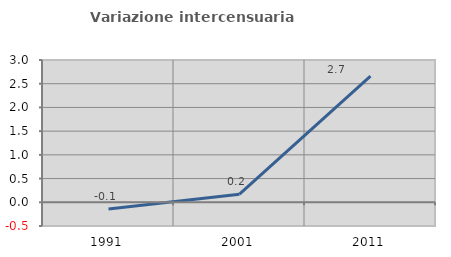
| Category | Variazione intercensuaria annua |
|---|---|
| 1991.0 | -0.142 |
| 2001.0 | 0.17 |
| 2011.0 | 2.661 |